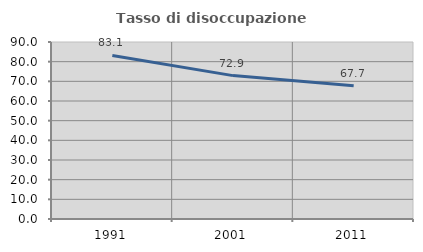
| Category | Tasso di disoccupazione giovanile  |
|---|---|
| 1991.0 | 83.145 |
| 2001.0 | 72.905 |
| 2011.0 | 67.712 |